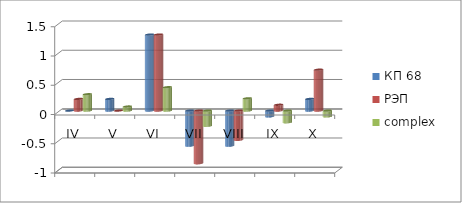
| Category | КП 68 | РЭП  | complex |
|---|---|---|---|
| IV | 0 | 0.2 | 0.28 |
| V | 0.2 | 0 | 0.07 |
| VI | 1.3 | 1.3 | 0.4 |
| VII | -0.6 | -0.9 | -0.26 |
| VIII | -0.6 | -0.5 | 0.21 |
| IX | -0.1 | 0.1 | -0.2 |
| X | 0.2 | 0.7 | -0.1 |